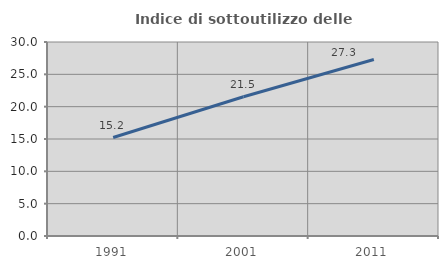
| Category | Indice di sottoutilizzo delle abitazioni  |
|---|---|
| 1991.0 | 15.224 |
| 2001.0 | 21.529 |
| 2011.0 | 27.285 |